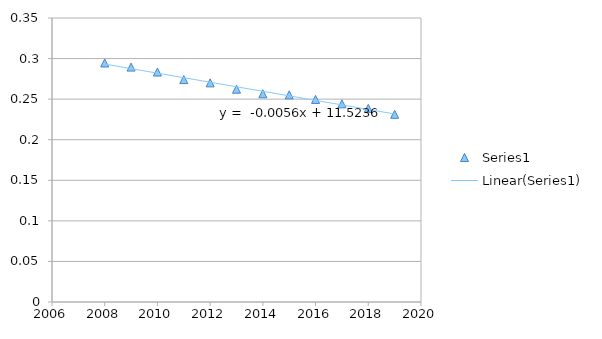
| Category | Series 0 |
|---|---|
| 2008.0 | 0.295 |
| 2009.0 | 0.29 |
| 2010.0 | 0.283 |
| 2011.0 | 0.274 |
| 2012.0 | 0.27 |
| 2013.0 | 0.262 |
| 2014.0 | 0.257 |
| 2015.0 | 0.255 |
| 2016.0 | 0.25 |
| 2017.0 | 0.244 |
| 2018.0 | 0.239 |
| 2019.0 | 0.231 |